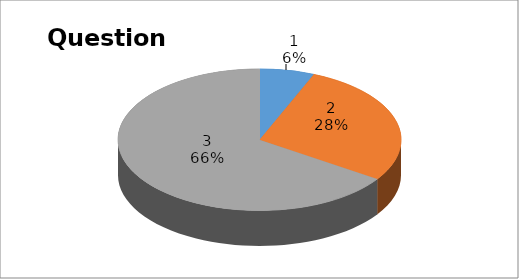
| Category | Series 0 |
|---|---|
| 0 | 2 |
| 1 | 9 |
| 2 | 21 |